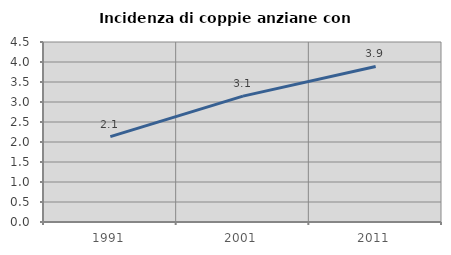
| Category | Incidenza di coppie anziane con figli |
|---|---|
| 1991.0 | 2.136 |
| 2001.0 | 3.147 |
| 2011.0 | 3.888 |